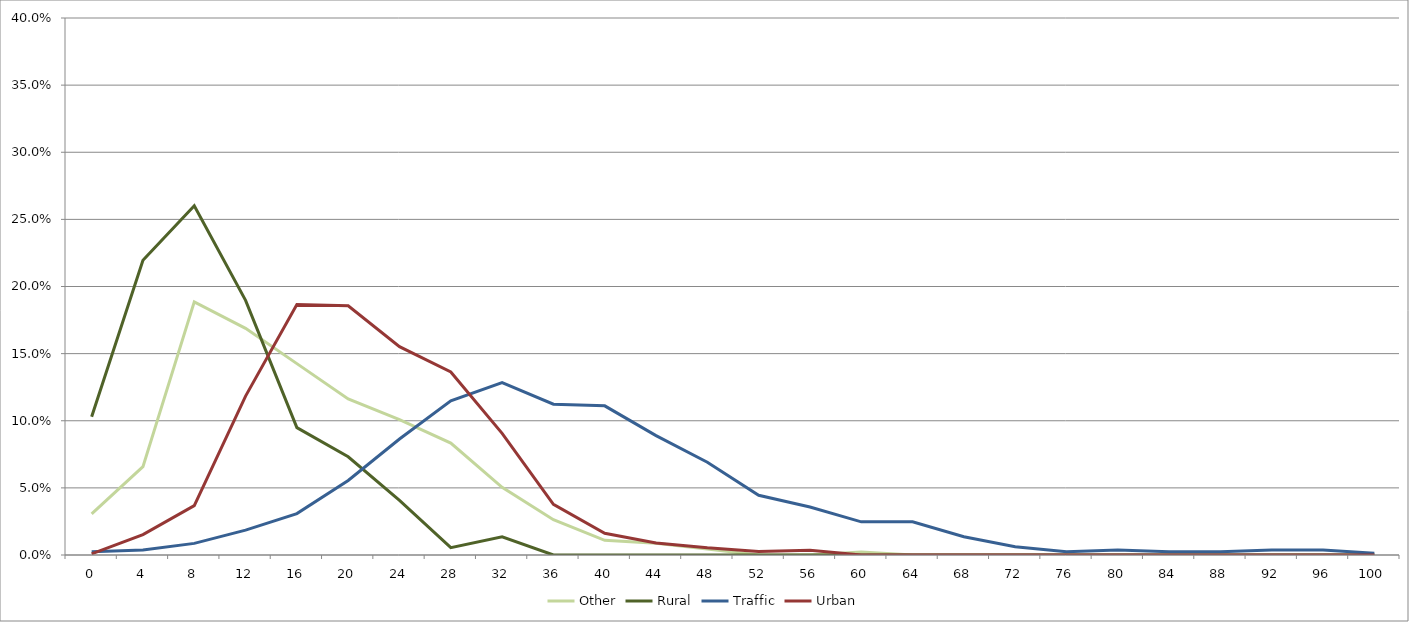
| Category | Other | Rural | Traffic | Urban |
|---|---|---|---|---|
| 0.0 | 0.031 | 0.103 | 0.002 | 0.001 |
| 4.0 | 0.066 | 0.22 | 0.004 | 0.015 |
| 8.0 | 0.189 | 0.26 | 0.009 | 0.037 |
| 12.0 | 0.169 | 0.19 | 0.019 | 0.118 |
| 16.0 | 0.143 | 0.095 | 0.031 | 0.187 |
| 20.0 | 0.116 | 0.073 | 0.056 | 0.186 |
| 24.0 | 0.101 | 0.041 | 0.086 | 0.155 |
| 28.0 | 0.083 | 0.005 | 0.115 | 0.136 |
| 32.0 | 0.05 | 0.014 | 0.128 | 0.091 |
| 36.0 | 0.026 | 0 | 0.112 | 0.038 |
| 40.0 | 0.011 | 0 | 0.111 | 0.016 |
| 44.0 | 0.009 | 0 | 0.089 | 0.009 |
| 48.0 | 0.004 | 0 | 0.069 | 0.005 |
| 52.0 | 0 | 0 | 0.044 | 0.003 |
| 56.0 | 0 | 0 | 0.036 | 0.004 |
| 60.0 | 0.002 | 0 | 0.025 | 0 |
| 64.0 | 0 | 0 | 0.025 | 0 |
| 68.0 | 0 | 0 | 0.014 | 0 |
| 72.0 | 0 | 0 | 0.006 | 0 |
| 76.0 | 0 | 0 | 0.002 | 0 |
| 80.0 | 0 | 0 | 0.004 | 0 |
| 84.0 | 0 | 0 | 0.002 | 0 |
| 88.0 | 0 | 0 | 0.002 | 0 |
| 92.0 | 0 | 0 | 0.004 | 0 |
| 96.0 | 0 | 0 | 0.004 | 0 |
| 100.0 | 0 | 0 | 0.001 | 0 |